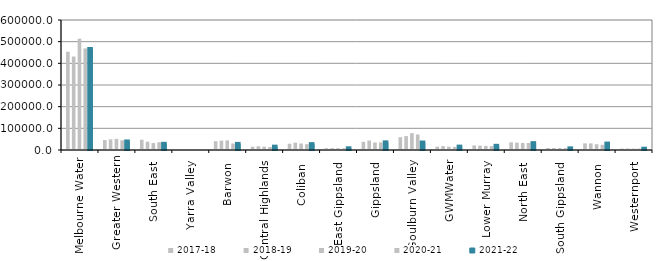
| Category | 2017-18 | 2018-19 | 2019-20 | 2020-21 | 2021-22 |
|---|---|---|---|---|---|
| Melbourne Water | 453419 | 431455.147 | 513651.425 | 468966.046 | 466284.903 |
| Greater Western | 46000 | 49352 | 51237 | 44908 | 39411 |
| South East  | 47300 | 38264 | 32006 | 35856.3 | 28576.5 |
| Yarra Valley  | 0 | 0 | 0 | 0 | 0 |
| Barwon  | 40649 | 43237.82 | 44258.933 | 30083 | 28166 |
| Central Highlands  | 15075.551 | 17381 | 14976 | 13556.34 | 15484 |
| Coliban  | 28898 | 33856.74 | 29938 | 26942 | 27053.6 |
| East Gippsland  | 8348 | 8872.26 | 8334 | 7636 | 7825 |
| Gippsland  | 37881 | 43725 | 34750 | 35385 | 35276 |
| Goulburn Valley  | 58908.164 | 64229 | 77754 | 71742.29 | 34572 |
| GWMWater | 15112 | 17951.812 | 15168.8 | 14155.1 | 15590.92 |
| Lower Murray  | 21071 | 20206.98 | 18837.9 | 17869.98 | 19348 |
| North East  | 35605 | 33905 | 32613.5 | 32197 | 31607 |
| South Gippsland  | 9248.68 | 9224 | 8874.69 | 8340 | 7580.664 |
| Wannon  | 30674 | 30490 | 26656 | 23887 | 29687 |
| Westernport  | 6637 | 6920 | 6458.7 | 6703.7 | 5973.7 |